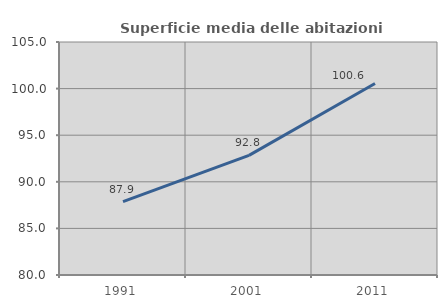
| Category | Superficie media delle abitazioni occupate |
|---|---|
| 1991.0 | 87.883 |
| 2001.0 | 92.834 |
| 2011.0 | 100.551 |